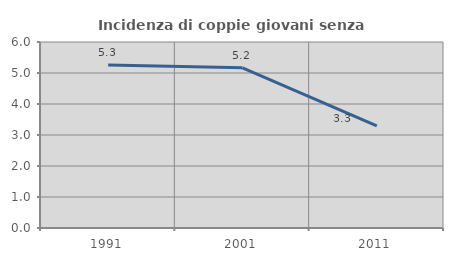
| Category | Incidenza di coppie giovani senza figli |
|---|---|
| 1991.0 | 5.256 |
| 2001.0 | 5.168 |
| 2011.0 | 3.296 |